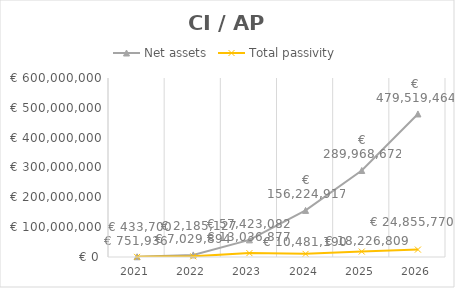
| Category | Net assets | Total passivity |
|---|---|---|
| 2021.0 | 751936.361 | 433700.251 |
| 2022.0 | 7029894.054 | 2185126.698 |
| 2023.0 | 57423082.249 | 13036877.419 |
| 2024.0 | 156224917.235 | 10481190.012 |
| 2025.0 | 289968671.846 | 18226808.673 |
| 2026.0 | 479519463.774 | 24855770.256 |